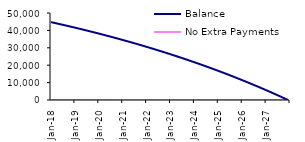
| Category | Balance | No Extra Payments |
|---|---|---|
| 2018-01-01 | 44747.09 | 44747.09 |
| 2018-02-01 | 44492.6 | 44492.599 |
| 2018-03-01 | 44236.52 | 44236.518 |
| 2018-04-01 | 43978.84 | 43978.836 |
| 2018-05-01 | 43719.55 | 43719.544 |
| 2018-06-01 | 43458.64 | 43458.631 |
| 2018-07-01 | 43196.1 | 43196.088 |
| 2018-08-01 | 42931.92 | 42931.903 |
| 2018-09-01 | 42666.08 | 42666.068 |
| 2018-10-01 | 42398.58 | 42398.57 |
| 2018-11-01 | 42129.41 | 42129.402 |
| 2018-12-01 | 41858.56 | 41858.55 |
| 2019-01-01 | 41586.02 | 41586.006 |
| 2019-02-01 | 41311.77 | 41311.759 |
| 2019-03-01 | 41035.81 | 41035.797 |
| 2019-04-01 | 40758.12 | 40758.111 |
| 2019-05-01 | 40478.7 | 40478.689 |
| 2019-06-01 | 40197.53 | 40197.521 |
| 2019-07-01 | 39914.6 | 39914.596 |
| 2019-08-01 | 39629.91 | 39629.902 |
| 2019-09-01 | 39343.44 | 39343.429 |
| 2019-10-01 | 39055.18 | 39055.165 |
| 2019-11-01 | 38765.11 | 38765.1 |
| 2019-12-01 | 38473.23 | 38473.222 |
| 2020-01-01 | 38179.53 | 38179.519 |
| 2020-02-01 | 37883.99 | 37883.981 |
| 2020-03-01 | 37586.6 | 37586.596 |
| 2020-04-01 | 37287.36 | 37287.352 |
| 2020-05-01 | 36986.25 | 36986.238 |
| 2020-06-01 | 36683.25 | 36683.242 |
| 2020-07-01 | 36378.36 | 36378.353 |
| 2020-08-01 | 36071.56 | 36071.557 |
| 2020-09-01 | 35762.85 | 35762.845 |
| 2020-10-01 | 35452.21 | 35452.202 |
| 2020-11-01 | 35139.63 | 35139.619 |
| 2020-12-01 | 34825.09 | 34825.081 |
| 2021-01-01 | 34508.59 | 34508.578 |
| 2021-02-01 | 34190.11 | 34190.097 |
| 2021-03-01 | 33869.64 | 33869.625 |
| 2021-04-01 | 33547.17 | 33547.15 |
| 2021-05-01 | 33222.68 | 33222.66 |
| 2021-06-01 | 32896.16 | 32896.141 |
| 2021-07-01 | 32567.6 | 32567.582 |
| 2021-08-01 | 32236.99 | 32236.969 |
| 2021-09-01 | 31904.31 | 31904.291 |
| 2021-10-01 | 31569.55 | 31569.532 |
| 2021-11-01 | 31232.7 | 31232.682 |
| 2021-12-01 | 30893.74 | 30893.726 |
| 2022-01-01 | 30552.67 | 30552.652 |
| 2022-02-01 | 30209.46 | 30209.446 |
| 2022-03-01 | 29864.11 | 29864.095 |
| 2022-04-01 | 29516.6 | 29516.586 |
| 2022-05-01 | 29166.92 | 29166.904 |
| 2022-06-01 | 28815.05 | 28815.037 |
| 2022-07-01 | 28460.98 | 28460.971 |
| 2022-08-01 | 28104.7 | 28104.693 |
| 2022-09-01 | 27746.19 | 27746.187 |
| 2022-10-01 | 27385.44 | 27385.441 |
| 2022-11-01 | 27022.44 | 27022.44 |
| 2022-12-01 | 26657.17 | 26657.17 |
| 2023-01-01 | 26289.62 | 26289.617 |
| 2023-02-01 | 25919.77 | 25919.767 |
| 2023-03-01 | 25547.61 | 25547.606 |
| 2023-04-01 | 25173.12 | 25173.118 |
| 2023-05-01 | 24796.29 | 24796.29 |
| 2023-06-01 | 24417.11 | 24417.107 |
| 2023-07-01 | 24035.56 | 24035.554 |
| 2023-08-01 | 23651.62 | 23651.616 |
| 2023-09-01 | 23265.28 | 23265.279 |
| 2023-10-01 | 22876.53 | 22876.527 |
| 2023-11-01 | 22485.35 | 22485.345 |
| 2023-12-01 | 22091.72 | 22091.719 |
| 2024-01-01 | 21695.63 | 21695.632 |
| 2024-02-01 | 21297.07 | 21297.069 |
| 2024-03-01 | 20896.02 | 20896.016 |
| 2024-04-01 | 20492.46 | 20492.456 |
| 2024-05-01 | 20086.38 | 20086.374 |
| 2024-06-01 | 19677.76 | 19677.754 |
| 2024-07-01 | 19266.59 | 19266.58 |
| 2024-08-01 | 18852.85 | 18852.836 |
| 2024-09-01 | 18436.52 | 18436.506 |
| 2024-10-01 | 18017.59 | 18017.574 |
| 2024-11-01 | 17596.04 | 17596.024 |
| 2024-12-01 | 17171.86 | 17171.839 |
| 2025-01-01 | 16745.02 | 16745.003 |
| 2025-02-01 | 16315.52 | 16315.5 |
| 2025-03-01 | 15883.33 | 15883.312 |
| 2025-04-01 | 15448.44 | 15448.422 |
| 2025-05-01 | 15010.83 | 15010.815 |
| 2025-06-01 | 14570.49 | 14570.472 |
| 2025-07-01 | 14127.4 | 14127.378 |
| 2025-08-01 | 13681.54 | 13681.514 |
| 2025-09-01 | 13232.89 | 13232.863 |
| 2025-10-01 | 12781.44 | 12781.409 |
| 2025-11-01 | 12327.16 | 12327.133 |
| 2025-12-01 | 11870.04 | 11870.017 |
| 2026-01-01 | 11410.07 | 11410.045 |
| 2026-02-01 | 10947.22 | 10947.198 |
| 2026-03-01 | 10481.48 | 10481.458 |
| 2026-04-01 | 10012.83 | 10012.807 |
| 2026-05-01 | 9541.25 | 9541.227 |
| 2026-06-01 | 9066.72 | 9066.699 |
| 2026-07-01 | 8589.23 | 8589.206 |
| 2026-08-01 | 8108.75 | 8108.729 |
| 2026-09-01 | 7625.27 | 7625.248 |
| 2026-10-01 | 7138.77 | 7138.746 |
| 2026-11-01 | 6649.23 | 6649.203 |
| 2026-12-01 | 6156.63 | 6156.601 |
| 2027-01-01 | 5660.95 | 5660.92 |
| 2027-02-01 | 5162.17 | 5162.14 |
| 2027-03-01 | 4660.27 | 4660.244 |
| 2027-04-01 | 4155.24 | 4155.21 |
| 2027-05-01 | 3647.05 | 3647.02 |
| 2027-06-01 | 3135.68 | 3135.654 |
| 2027-07-01 | 2621.12 | 2621.092 |
| 2027-08-01 | 2103.34 | 2103.314 |
| 2027-09-01 | 1582.33 | 1582.3 |
| 2027-10-01 | 1058.06 | 1058.029 |
| 2027-11-01 | 530.51 | 530.482 |
| 2027-12-01 | 0 | -0.363 |